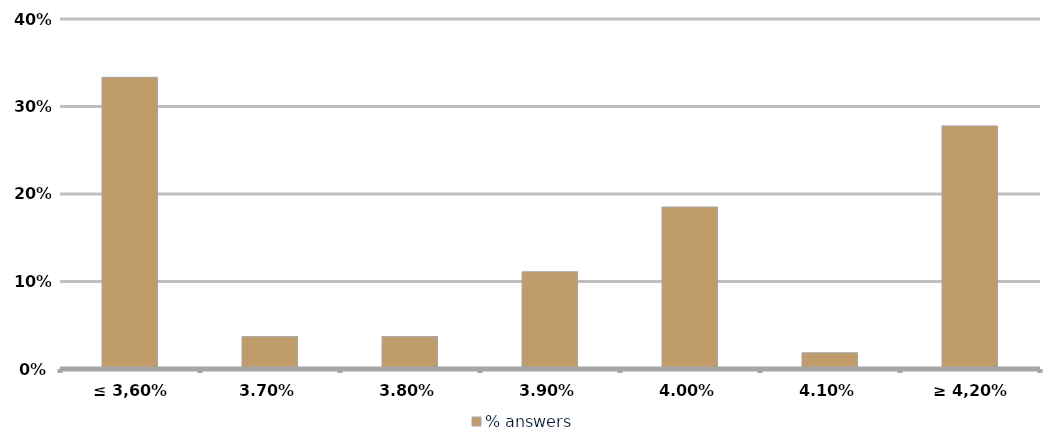
| Category | % answers |
|---|---|
| ≤ 3,60% | 0.333 |
| 3,70% | 0.037 |
| 3,80% | 0.037 |
| 3,90% | 0.111 |
| 4,00% | 0.185 |
| 4,10% | 0.019 |
| ≥ 4,20% | 0.278 |